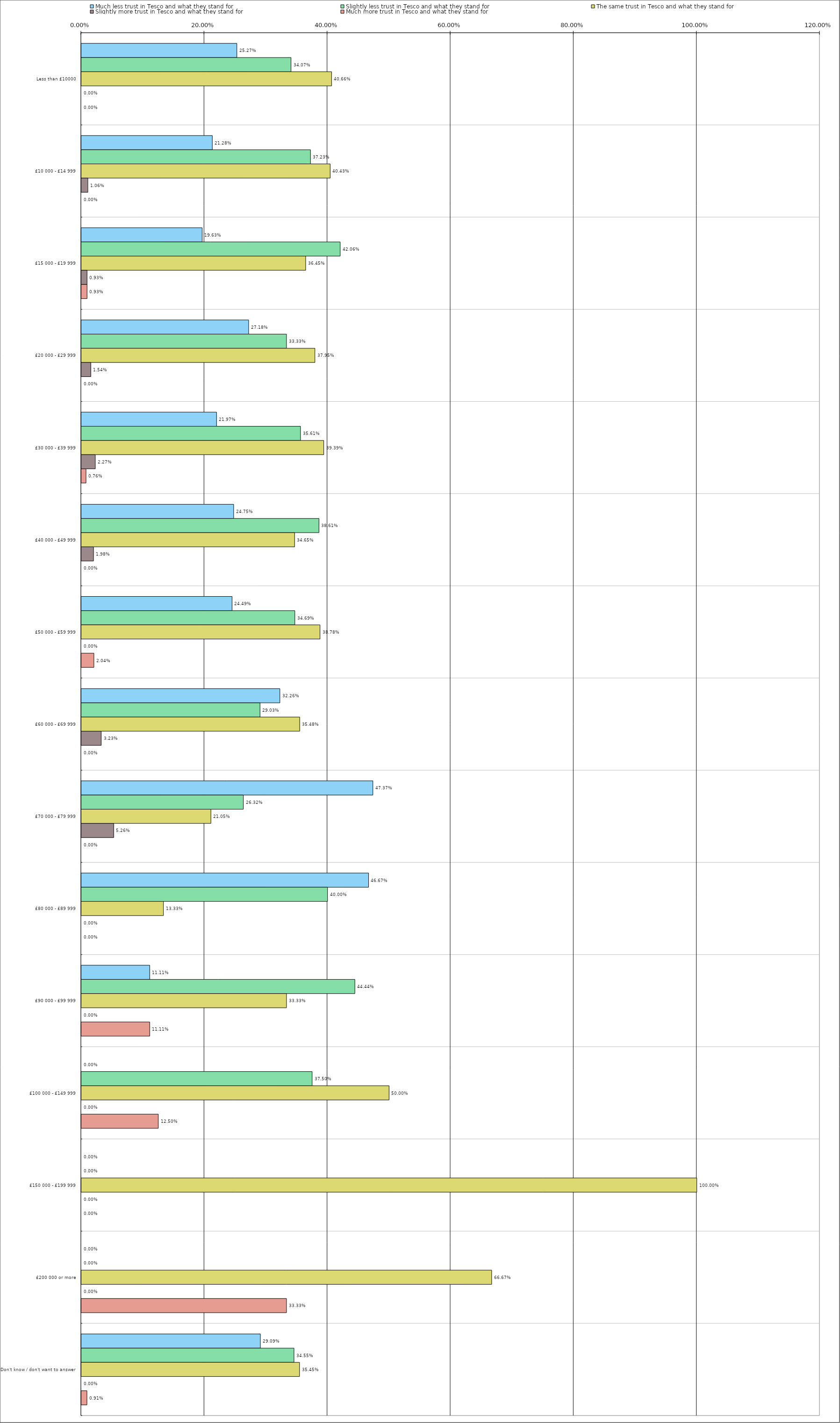
| Category | Much less trust in Tesco and what they stand for | Slightly less trust in Tesco and what they stand for | The same trust in Tesco and what they stand for | Slightly more trust in Tesco and what they stand for | Much more trust in Tesco and what they stand for |
|---|---|---|---|---|---|
| 0 | 0.253 | 0.341 | 0.407 | 0 | 0 |
| 1 | 0.213 | 0.372 | 0.404 | 0.011 | 0 |
| 2 | 0.196 | 0.421 | 0.364 | 0.009 | 0.009 |
| 3 | 0.272 | 0.333 | 0.38 | 0.015 | 0 |
| 4 | 0.22 | 0.356 | 0.394 | 0.023 | 0.008 |
| 5 | 0.248 | 0.386 | 0.346 | 0.02 | 0 |
| 6 | 0.245 | 0.347 | 0.388 | 0 | 0.02 |
| 7 | 0.323 | 0.29 | 0.355 | 0.032 | 0 |
| 8 | 0.474 | 0.263 | 0.21 | 0.053 | 0 |
| 9 | 0.467 | 0.4 | 0.133 | 0 | 0 |
| 10 | 0.111 | 0.444 | 0.333 | 0 | 0.111 |
| 11 | 0 | 0.375 | 0.5 | 0 | 0.125 |
| 12 | 0 | 0 | 1 | 0 | 0 |
| 13 | 0 | 0 | 0.667 | 0 | 0.333 |
| 14 | 0.291 | 0.346 | 0.354 | 0 | 0.009 |